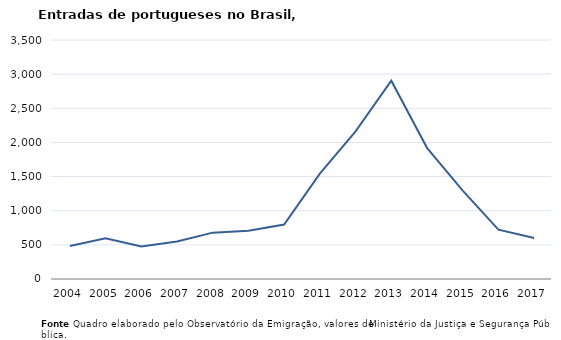
| Category | Entradas |
|---|---|
| 2004.0 | 482 |
| 2005.0 | 595 |
| 2006.0 | 477 |
| 2007.0 | 550 |
| 2008.0 | 679 |
| 2009.0 | 708 |
| 2010.0 | 798 |
| 2011.0 | 1543 |
| 2012.0 | 2161 |
| 2013.0 | 2904 |
| 2014.0 | 1921 |
| 2015.0 | 1294 |
| 2016.0 | 722 |
| 2017.0 | 601 |